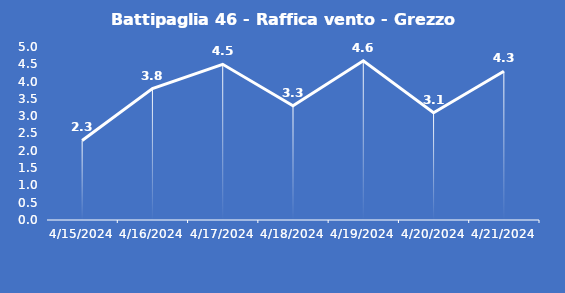
| Category | Battipaglia 46 - Raffica vento - Grezzo (m/s) |
|---|---|
| 4/15/24 | 2.3 |
| 4/16/24 | 3.8 |
| 4/17/24 | 4.5 |
| 4/18/24 | 3.3 |
| 4/19/24 | 4.6 |
| 4/20/24 | 3.1 |
| 4/21/24 | 4.3 |